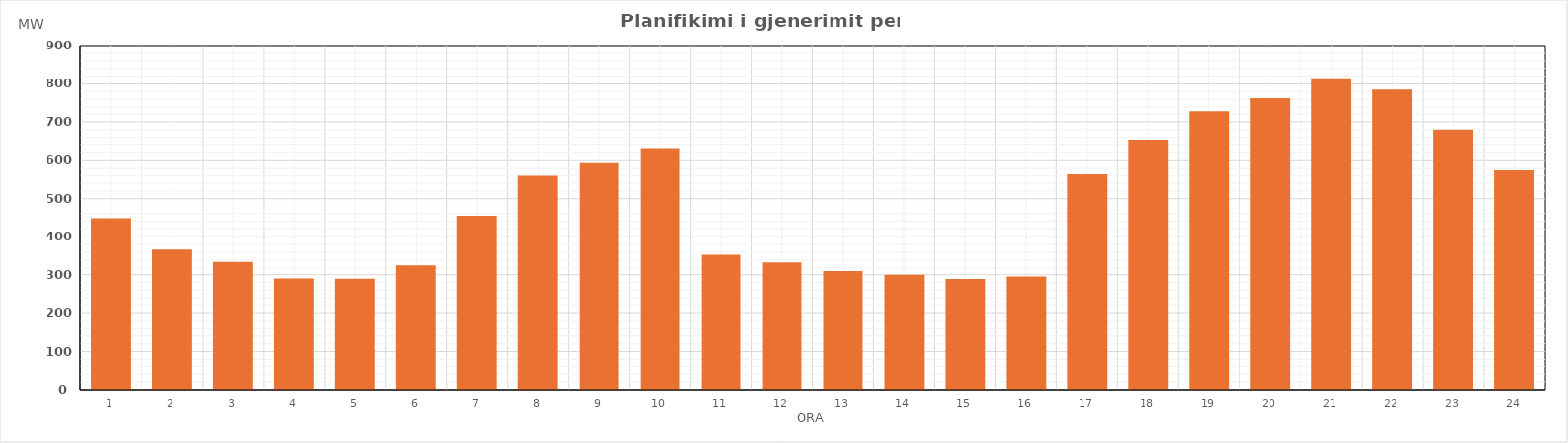
| Category | Max (MW) |
|---|---|
| 0 | 447.59 |
| 1 | 367.01 |
| 2 | 335.35 |
| 3 | 290.02 |
| 4 | 289.64 |
| 5 | 326.4 |
| 6 | 454.02 |
| 7 | 558.72 |
| 8 | 594.1 |
| 9 | 630.07 |
| 10 | 353.96 |
| 11 | 334.28 |
| 12 | 309.08 |
| 13 | 299.86 |
| 14 | 288.98 |
| 15 | 295.38 |
| 16 | 565.02 |
| 17 | 653.8 |
| 18 | 727.07 |
| 19 | 763.29 |
| 20 | 814.48 |
| 21 | 785.04 |
| 22 | 680.09 |
| 23 | 575.79 |